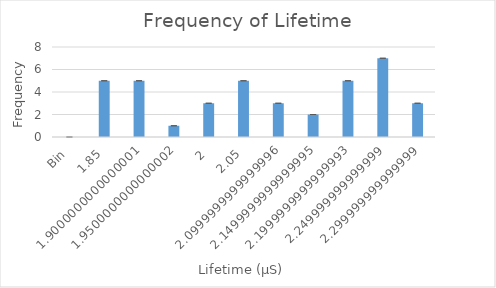
| Category | Series 0 |
|---|---|
| Bin | 0 |
| 1.85 | 5 |
| 1.9 | 5 |
| 1.95 | 1 |
| 2 | 3 |
| 2.05 | 5 |
| 2.1 | 3 |
| 2.15 | 2 |
| 2.2 | 5 |
| 2.25 | 7 |
| 2.3 | 3 |